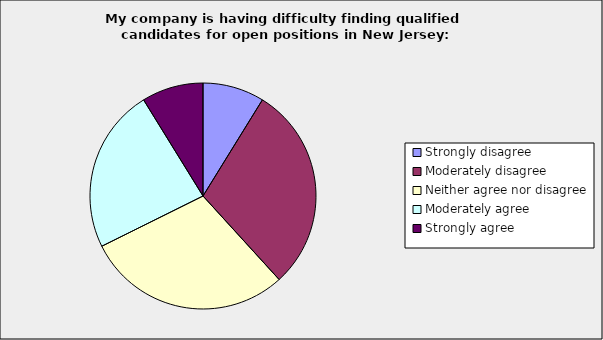
| Category | Series 0 |
|---|---|
| Strongly disagree | 0.088 |
| Moderately disagree | 0.294 |
| Neither agree nor disagree | 0.294 |
| Moderately agree | 0.235 |
| Strongly agree | 0.088 |